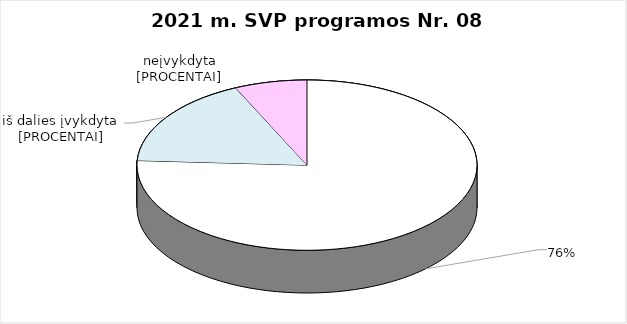
| Category | Series 0 |
|---|---|
| 0 | 22 |
| 1 | 5 |
| 2 | 2 |